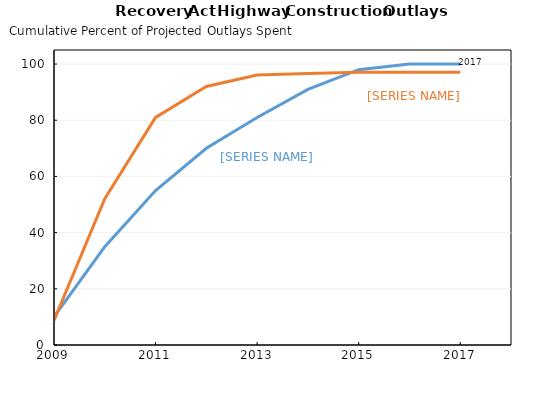
| Category | Projected | Actual |
|---|---|---|
| 2009-12-31 | 10 | 8.789 |
| 2010-12-31 | 35 | 52.051 |
| 2011-12-31 | 55 | 81.018 |
| 2012-12-31 | 70 | 92.029 |
| 2013-12-31 | 81 | 96.087 |
| 2014-12-31 | 91 | 96.655 |
| 2015-12-31 | 98 | 97.047 |
| 2016-12-31 | 100 | 97.047 |
| 2017-12-31 | 100 | 97.047 |